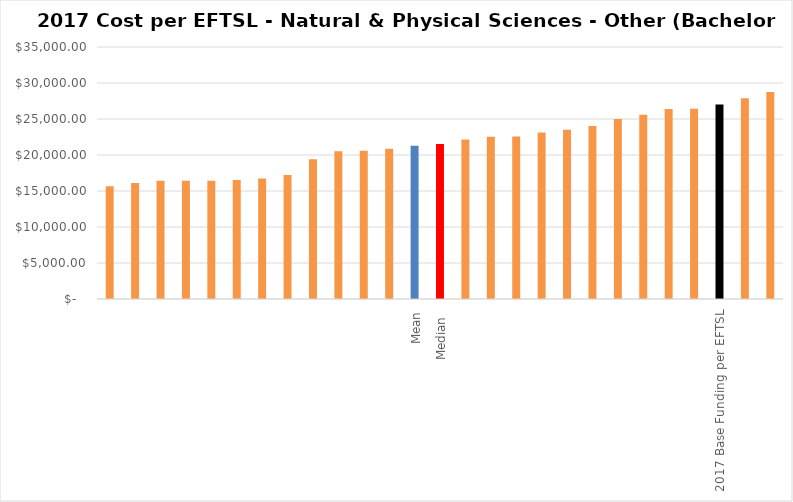
| Category | Series 0 |
|---|---|
|  | 15648.137 |
|  | 16123.283 |
|  | 16412.844 |
|  | 16415.453 |
|  | 16429.587 |
|  | 16538.462 |
|  | 16744.408 |
|  | 17219.698 |
|  | 19420.283 |
|  | 20518.706 |
|  | 20583.687 |
|  | 20858.063 |
| Mean | 21295.13 |
| Median  | 21514.14 |
|  | 22151.388 |
|  | 22540.03 |
|  | 22580.058 |
|  | 23109.853 |
|  | 23511.029 |
|  | 24012.815 |
|  | 24983.578 |
|  | 25589.347 |
|  | 26388.485 |
|  | 26434.115 |
| 2017 Base Funding per EFTSL | 27021 |